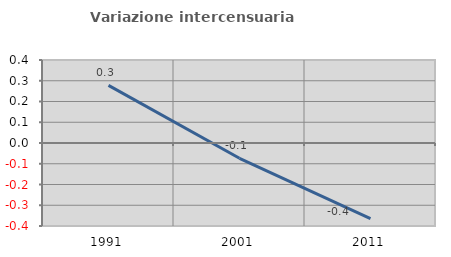
| Category | Variazione intercensuaria annua |
|---|---|
| 1991.0 | 0.278 |
| 2001.0 | -0.074 |
| 2011.0 | -0.364 |